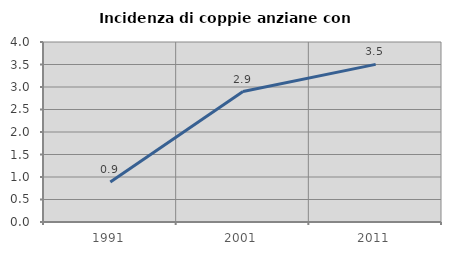
| Category | Incidenza di coppie anziane con figli |
|---|---|
| 1991.0 | 0.888 |
| 2001.0 | 2.899 |
| 2011.0 | 3.503 |